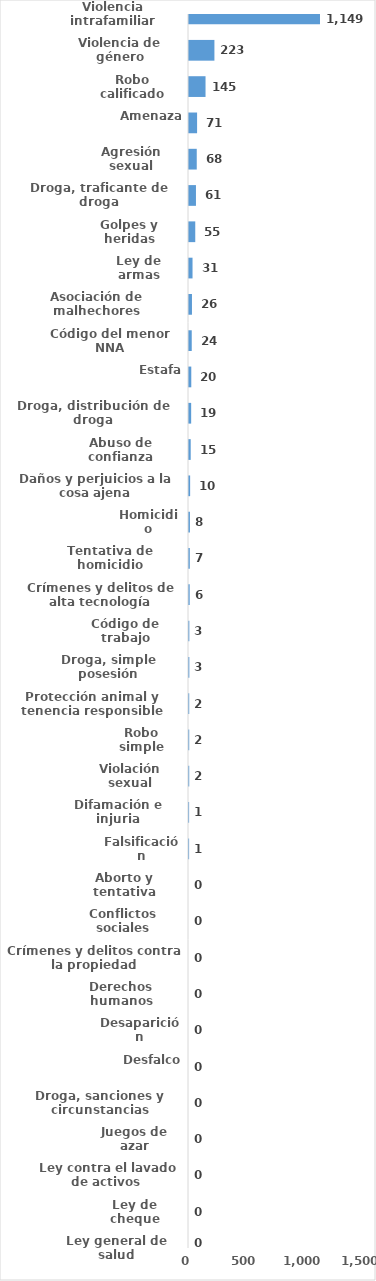
| Category | Series 0 |
|---|---|
| Violencia intrafamiliar | 1149 |
| Violencia de género | 223 |
| Robo calificado | 145 |
| Amenaza | 71 |
| Agresión sexual | 68 |
| Droga, traficante de droga | 61 |
| Golpes y heridas | 55 |
| Ley de armas | 31 |
| Asociación de malhechores | 26 |
| Código del menor NNA | 24 |
| Estafa | 20 |
| Droga, distribución de droga | 19 |
| Abuso de confianza | 15 |
| Daños y perjuicios a la cosa ajena | 10 |
| Homicidio | 8 |
| Tentativa de homicidio | 7 |
| Crímenes y delitos de alta tecnología | 6 |
| Código de trabajo | 3 |
| Droga, simple posesión | 3 |
| Protección animal y tenencia responsible | 2 |
| Robo simple | 2 |
| Violación sexual | 2 |
| Difamación e injuria | 1 |
| Falsificación | 1 |
| Aborto y tentativa | 0 |
| Conflictos sociales | 0 |
| Crímenes y delitos contra la propiedad | 0 |
| Derechos humanos | 0 |
| Desaparición | 0 |
| Desfalco | 0 |
| Droga, sanciones y circunstancias agravantes | 0 |
| Juegos de azar | 0 |
| Ley contra el lavado de activos  | 0 |
| Ley de cheque | 0 |
| Ley general de salud | 0 |